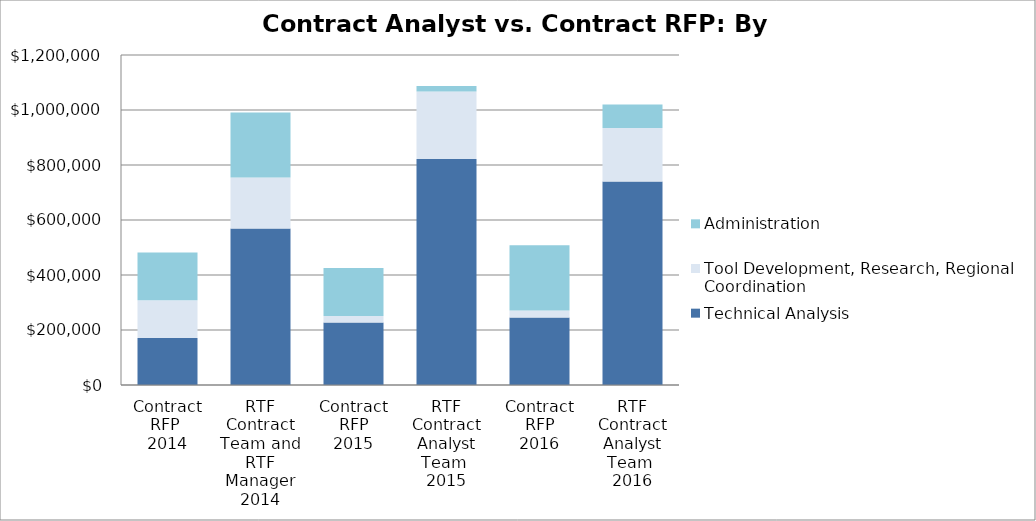
| Category | Technical Analysis | Tool Development, Research, Regional Coordination  | Administration |
|---|---|---|---|
| Contract RFP 
2014 | 170500 | 137500 | 174000 |
| RTF Contract Team and RTF Manager
2014 | 569000 | 186000 | 236000 |
| Contract RFP
2015 | 227500 | 23000 | 175100 |
| RTF Contract Analyst Team 
2015 | 822000 | 245000 | 20000 |
| Contract RFP
2016 | 245500 | 25000 | 237500 |
| RTF Contract Analyst Team 
2016 | 740000 | 195000 | 85000 |